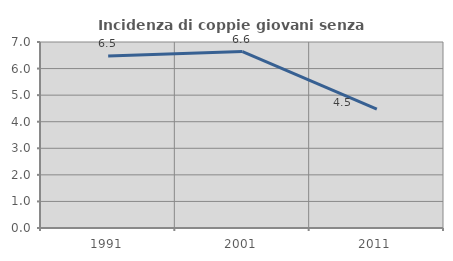
| Category | Incidenza di coppie giovani senza figli |
|---|---|
| 1991.0 | 6.472 |
| 2001.0 | 6.64 |
| 2011.0 | 4.478 |